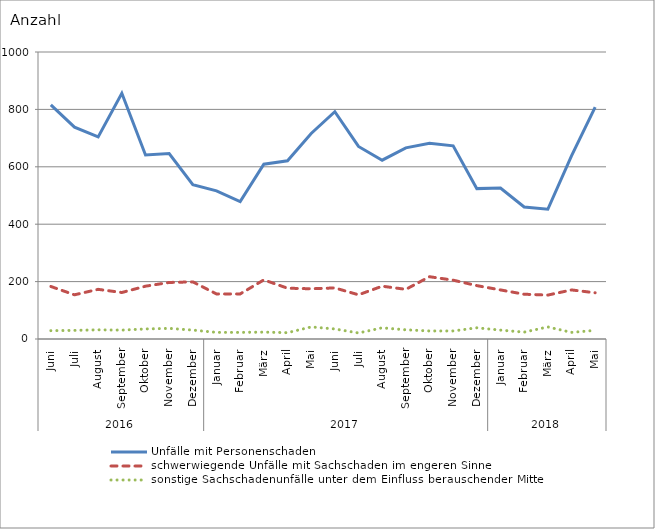
| Category | Unfälle mit Personenschaden | schwerwiegende Unfälle mit Sachschaden im engeren Sinne | sonstige Sachschadenunfälle unter dem Einfluss berauschender Mittel |
|---|---|---|---|
| 0 | 816 | 183 | 29 |
| 1 | 738 | 154 | 30 |
| 2 | 704 | 173 | 32 |
| 3 | 856 | 162 | 31 |
| 4 | 641 | 184 | 35 |
| 5 | 646 | 197 | 37 |
| 6 | 538 | 199 | 31 |
| 7 | 516 | 157 | 23 |
| 8 | 479 | 157 | 23 |
| 9 | 609 | 206 | 24 |
| 10 | 621 | 177 | 22 |
| 11 | 716 | 175 | 42 |
| 12 | 792 | 178 | 35 |
| 13 | 671 | 154 | 21 |
| 14 | 623 | 184 | 39 |
| 15 | 666 | 173 | 32 |
| 16 | 682 | 217 | 28 |
| 17 | 673 | 205 | 28 |
| 18 | 524 | 186 | 39 |
| 19 | 526 | 171 | 31 |
| 20 | 460 | 156 | 24 |
| 21 | 452 | 153 | 42 |
| 22 | 638 | 171 | 23 |
| 23 | 808 | 161 | 30 |